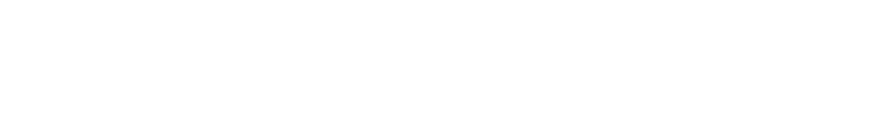
| Category | FINANCIACIÓN TOTAL | GASTOS TOTALES |
|---|---|---|
| 0 | 0 | 0 |